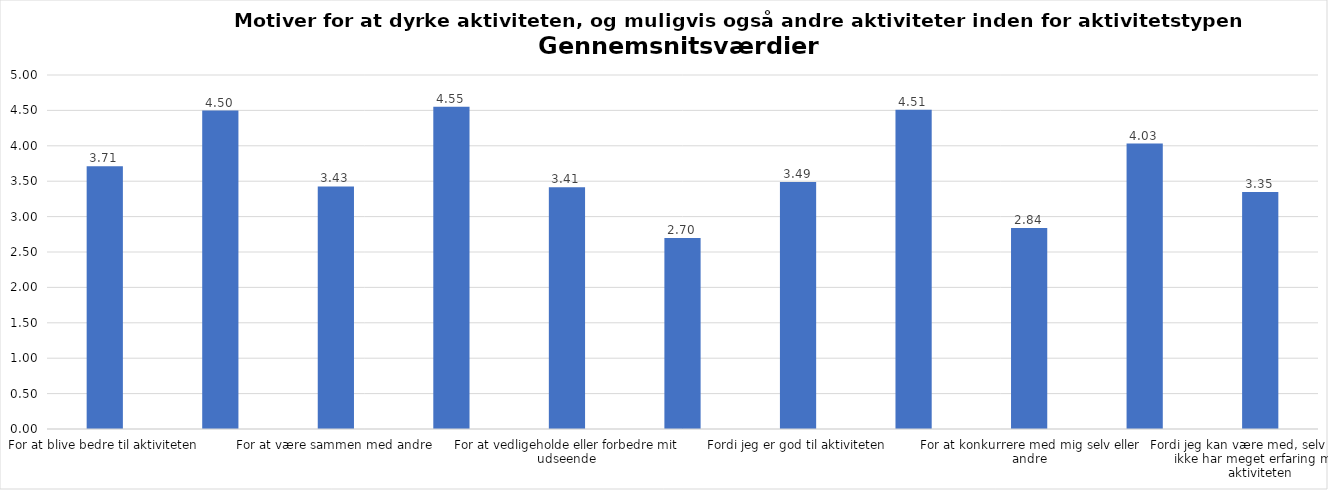
| Category | Gennemsnit |
|---|---|
| For at blive bedre til aktiviteten | 3.711 |
| For at vedligeholde eller forbedre min sundhed (fx helbred, fysisk form) | 4.497 |
| For at være sammen med andre | 3.426 |
| For at gøre noget godt for mig selv | 4.552 |
| For at vedligeholde eller forbedre mit udseende | 3.414 |
| Fordi andre i min omgangskreds opmuntrer mig til det | 2.698 |
| Fordi jeg er god til aktiviteten | 3.488 |
| Fordi jeg godt kan lide aktiviteten | 4.51 |
| For at konkurrere med mig selv eller andre | 2.84 |
| Fordi aktiviteten passer godt ind i min hverdag | 4.031 |
| Fordi jeg kan være med, selv om jeg ikke har meget erfaring med aktiviteten | 3.347 |